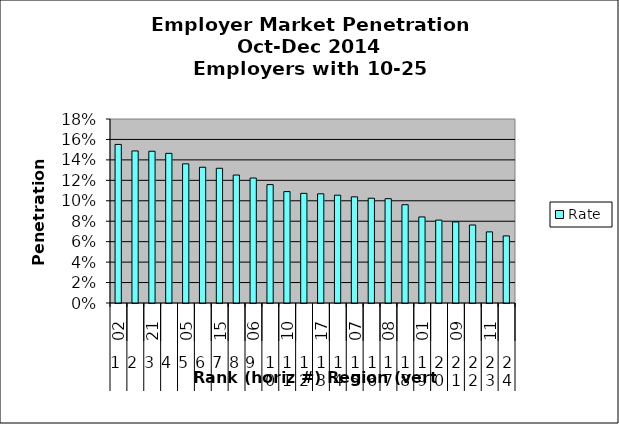
| Category | Rate |
|---|---|
| 0 | 0.155 |
| 1 | 0.149 |
| 2 | 0.148 |
| 3 | 0.146 |
| 4 | 0.136 |
| 5 | 0.133 |
| 6 | 0.132 |
| 7 | 0.125 |
| 8 | 0.122 |
| 9 | 0.116 |
| 10 | 0.109 |
| 11 | 0.107 |
| 12 | 0.107 |
| 13 | 0.105 |
| 14 | 0.104 |
| 15 | 0.102 |
| 16 | 0.102 |
| 17 | 0.096 |
| 18 | 0.084 |
| 19 | 0.081 |
| 20 | 0.079 |
| 21 | 0.076 |
| 22 | 0.07 |
| 23 | 0.066 |